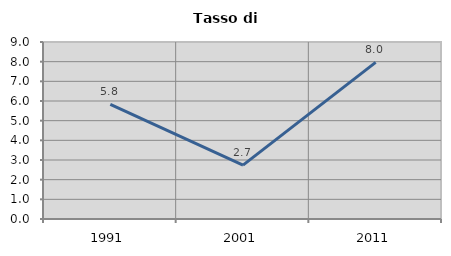
| Category | Tasso di disoccupazione   |
|---|---|
| 1991.0 | 5.83 |
| 2001.0 | 2.739 |
| 2011.0 | 7.961 |